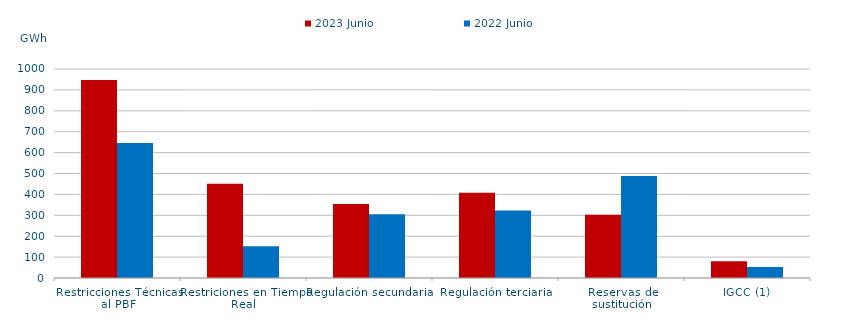
| Category | 2023 Junio | 2022 Junio |
|---|---|---|
| Restricciones Técnicas al PBF | 947.549 | 645.671 |
| Restriciones en Tiempo Real | 450.868 | 152.137 |
| Regulación secundaria | 353.485 | 304.432 |
| Regulación terciaria | 407.899 | 323.551 |
| Reservas de sustitución | 303.169 | 487.806 |
| IGCC (1) | 80.313 | 53.17 |